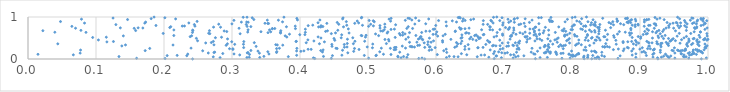
| Category | Series 0 |
|---|---|
| 0.24205689073162623 | 0.001 |
| 0.5834555230468341 | 0.002 |
| 0.9263703860872018 | 0.003 |
| 0.9902408202986827 | 0.004 |
| 0.8291067344623665 | 0.005 |
| 0.8178307525034634 | 0.006 |
| 0.8400675012704694 | 0.007 |
| 0.7462016074231488 | 0.008 |
| 0.6856056325484058 | 0.009 |
| 0.2016072167252148 | 0.01 |
| 0.42173816963347577 | 0.011 |
| 0.5745983142408261 | 0.012 |
| 0.446124398810435 | 0.013 |
| 0.8675882755222408 | 0.014 |
| 0.8357171675206022 | 0.015 |
| 0.785211908813913 | 0.016 |
| 0.15973413688587618 | 0.017 |
| 0.5009533023470878 | 0.018 |
| 0.8335764846936609 | 0.019 |
| 0.9717467180822348 | 0.02 |
| 0.9512849242277234 | 0.021 |
| 0.7972485682354438 | 0.022 |
| 0.5794474353078632 | 0.023 |
| 0.713394292914638 | 0.024 |
| 0.9975322524047576 | 0.025 |
| 0.4197658272013632 | 0.026 |
| 0.8229744605567039 | 0.027 |
| 0.9257722374405295 | 0.028 |
| 0.5486734143937347 | 0.029 |
| 0.9428053404983558 | 0.03 |
| 0.6962093785871877 | 0.031 |
| 0.2825017324264942 | 0.032 |
| 0.7530674486180673 | 0.033 |
| 0.6153970054187725 | 0.034 |
| 0.3219353120712748 | 0.035 |
| 0.34076091171720196 | 0.036 |
| 0.7637678185612877 | 0.037 |
| 0.5571889665695007 | 0.038 |
| 0.8939043022871926 | 0.039 |
| 0.3253150095543737 | 0.04 |
| 0.8389605966028697 | 0.041 |
| 0.6777095777613078 | 0.042 |
| 0.9315042345172243 | 0.043 |
| 0.8170834396213889 | 0.044 |
| 0.9191426719083583 | 0.045 |
| 0.8231961599162155 | 0.046 |
| 0.9416617662311146 | 0.047 |
| 0.9648278417991749 | 0.048 |
| 0.5441939767214274 | 0.049 |
| 0.8374769481175671 | 0.05 |
| 0.27249339708742004 | 0.051 |
| 0.7171692802267854 | 0.052 |
| 0.6325138611821493 | 0.053 |
| 0.660695487391268 | 0.054 |
| 0.9676928087851172 | 0.055 |
| 0.3828518817628516 | 0.056 |
| 0.6265141953982992 | 0.057 |
| 0.133804860888613 | 0.058 |
| 0.5523870485807223 | 0.059 |
| 0.8477426205458636 | 0.06 |
| 0.9639104732571785 | 0.061 |
| 0.4345416529370042 | 0.062 |
| 0.346927104693528 | 0.063 |
| 0.6195624282289387 | 0.064 |
| 0.5438661104671647 | 0.065 |
| 0.8008854926883698 | 0.066 |
| 0.9347986931342904 | 0.067 |
| 0.7208049720291315 | 0.068 |
| 0.8177155724072791 | 0.069 |
| 0.8046382924731201 | 0.07 |
| 0.6882361211552779 | 0.071 |
| 0.9453475826081735 | 0.072 |
| 0.8022181116446973 | 0.073 |
| 0.6890975781424952 | 0.074 |
| 0.8707659925870614 | 0.075 |
| 0.7292288013186655 | 0.076 |
| 0.9395475771430393 | 0.077 |
| 0.2335441791927017 | 0.078 |
| 0.5116418523234801 | 0.079 |
| 0.44771776410358477 | 0.08 |
| 0.20464590029455781 | 0.081 |
| 0.8439408494191557 | 0.082 |
| 0.9093582169060935 | 0.083 |
| 0.8305041743603956 | 0.084 |
| 0.4946027166648584 | 0.085 |
| 0.21936245110016322 | 0.086 |
| 0.7985134555732452 | 0.087 |
| 0.3950776898445026 | 0.088 |
| 0.5123044944880372 | 0.089 |
| 0.8233392075472719 | 0.09 |
| 0.4616097077237403 | 0.091 |
| 0.9729984853158574 | 0.092 |
| 0.6663540896584635 | 0.093 |
| 0.8885416575196844 | 0.094 |
| 0.6715264407055564 | 0.095 |
| 0.8013334454982551 | 0.096 |
| 0.3113658421585407 | 0.097 |
| 0.964575616553435 | 0.098 |
| 0.06666667838972837 | 0.099 |
| 0.7097229706511804 | 0.1 |
| 0.6452586074628226 | 0.101 |
| 0.7144393302943459 | 0.102 |
| 0.8069005495552453 | 0.103 |
| 0.5586465298602132 | 0.104 |
| 0.6019350951166507 | 0.105 |
| 0.9759736476502108 | 0.106 |
| 0.5337749565718211 | 0.107 |
| 0.7774976790599534 | 0.108 |
| 0.3257487222347137 | 0.109 |
| 0.9829123280076261 | 0.11 |
| 0.9188379794238268 | 0.111 |
| 0.014668085009601208 | 0.112 |
| 0.5227122172664884 | 0.113 |
| 0.7954677442896916 | 0.114 |
| 0.745559671468521 | 0.115 |
| 0.9375169310855509 | 0.116 |
| 0.2349852604139013 | 0.117 |
| 0.7957259100381745 | 0.118 |
| 0.35434886356742107 | 0.119 |
| 0.30293943835276244 | 0.12 |
| 0.809973361927424 | 0.121 |
| 0.960519921300205 | 0.122 |
| 0.8939514636304495 | 0.123 |
| 0.7436727593851542 | 0.124 |
| 0.9778392275432664 | 0.125 |
| 0.960863681554112 | 0.126 |
| 0.6373547500469665 | 0.127 |
| 0.6846752663872728 | 0.128 |
| 0.8094812916844065 | 0.129 |
| 0.2864530213845176 | 0.13 |
| 0.8095241710766525 | 0.131 |
| 0.9795934921756614 | 0.132 |
| 0.783775620037591 | 0.133 |
| 0.9205133624781934 | 0.134 |
| 0.7678927684292138 | 0.135 |
| 0.9710639248140867 | 0.136 |
| 0.7015336930465437 | 0.137 |
| 0.78693123598428 | 0.138 |
| 0.34030641638963843 | 0.139 |
| 0.07670811117182919 | 0.14 |
| 0.7767933382393762 | 0.141 |
| 0.9513066725945237 | 0.142 |
| 0.2651459383407172 | 0.143 |
| 0.9920012197920969 | 0.144 |
| 0.32241331174470805 | 0.145 |
| 0.7592727641152089 | 0.146 |
| 0.4703293602537986 | 0.147 |
| 0.9081234858278582 | 0.148 |
| 0.6967008585284777 | 0.149 |
| 0.7613366894837106 | 0.15 |
| 0.7049680455251625 | 0.151 |
| 0.9729335320122706 | 0.152 |
| 0.3235952076423468 | 0.153 |
| 0.27347545295776227 | 0.154 |
| 0.3655177406982778 | 0.155 |
| 0.7764128381559762 | 0.156 |
| 0.6158213532081118 | 0.157 |
| 0.8354322324054811 | 0.158 |
| 0.9299492396545245 | 0.159 |
| 0.8438570506298135 | 0.16 |
| 0.7184587417686823 | 0.161 |
| 0.5466463155740824 | 0.162 |
| 0.7400194913570332 | 0.163 |
| 0.2746247432140186 | 0.164 |
| 0.9027677317595887 | 0.165 |
| 0.7683102171802988 | 0.166 |
| 0.43302911748130085 | 0.167 |
| 0.7760430827437277 | 0.168 |
| 0.6920986451529269 | 0.169 |
| 0.7619003909260341 | 0.17 |
| 0.5172911492180268 | 0.171 |
| 0.9777748916052434 | 0.172 |
| 0.3526970619683715 | 0.173 |
| 0.9905202558672441 | 0.174 |
| 0.9893204668001245 | 0.175 |
| 0.3658900113440076 | 0.176 |
| 0.8340615326602843 | 0.177 |
| 0.6861420343213775 | 0.178 |
| 0.7652841763965242 | 0.179 |
| 0.9056231066859116 | 0.18 |
| 0.9850133569604297 | 0.181 |
| 0.47897600698141374 | 0.182 |
| 0.4013302055376724 | 0.183 |
| 0.8288523711050375 | 0.184 |
| 0.7493189545988588 | 0.185 |
| 0.8328991154930446 | 0.186 |
| 0.9590927789592565 | 0.187 |
| 0.3382040535337245 | 0.188 |
| 0.7993858443803757 | 0.189 |
| 0.8878258723299189 | 0.19 |
| 0.3950278307335754 | 0.191 |
| 0.9592194836023622 | 0.192 |
| 0.4057744827877197 | 0.193 |
| 0.9489546333223964 | 0.194 |
| 0.25688146245141874 | 0.195 |
| 0.6113996448847994 | 0.196 |
| 0.8754615488586553 | 0.197 |
| 0.9873023142587333 | 0.198 |
| 0.1723325806796004 | 0.199 |
| 0.4304839658393635 | 0.2 |
| 0.9564014765936392 | 0.201 |
| 0.9651437258255525 | 0.202 |
| 0.32778871010257893 | 0.203 |
| 0.9620078467304354 | 0.204 |
| 0.8207490215397654 | 0.205 |
| 0.5900059246834644 | 0.206 |
| 0.9470664870901452 | 0.207 |
| 0.4625970322010442 | 0.208 |
| 0.9299640899828344 | 0.209 |
| 0.9670944123393544 | 0.21 |
| 0.9552205234174423 | 0.211 |
| 0.9195433291157692 | 0.212 |
| 0.07732807185703817 | 0.213 |
| 0.9783716390098799 | 0.214 |
| 0.8175880821998233 | 0.215 |
| 0.679745748641263 | 0.216 |
| 0.4339830471939868 | 0.217 |
| 0.9844703387354559 | 0.218 |
| 0.9943197045019005 | 0.219 |
| 0.593608630250575 | 0.22 |
| 0.5384425386120857 | 0.221 |
| 0.920534441926504 | 0.222 |
| 0.8608695864663789 | 0.223 |
| 0.763945343737911 | 0.224 |
| 0.9819815237848935 | 0.225 |
| 0.5408064594873792 | 0.226 |
| 0.48683813008199156 | 0.227 |
| 0.30134639597442897 | 0.228 |
| 0.6424050178918339 | 0.229 |
| 0.41642668339267286 | 0.23 |
| 0.7222063287306725 | 0.231 |
| 0.4119005723261041 | 0.232 |
| 0.6944750720295223 | 0.233 |
| 0.61500249366964 | 0.234 |
| 0.8997816031872654 | 0.235 |
| 0.9211460038378547 | 0.236 |
| 0.7192062302618909 | 0.237 |
| 0.868180979207175 | 0.238 |
| 0.6485150823996157 | 0.239 |
| 0.966900326906095 | 0.24 |
| 0.8766295280476818 | 0.241 |
| 0.8901247257162751 | 0.242 |
| 0.9152392050451452 | 0.243 |
| 0.30126286391437934 | 0.244 |
| 0.2963968111671182 | 0.245 |
| 0.7870928804792657 | 0.246 |
| 0.9112240688921044 | 0.247 |
| 0.36561000870280036 | 0.248 |
| 0.6982174641738597 | 0.249 |
| 0.45461621948856884 | 0.25 |
| 0.4801415419453036 | 0.251 |
| 0.17902237937965004 | 0.252 |
| 0.3953869875452674 | 0.253 |
| 0.5328979671274986 | 0.254 |
| 0.7412031670939694 | 0.255 |
| 0.3696973536081519 | 0.256 |
| 0.45293102555122416 | 0.257 |
| 0.5196225447009848 | 0.258 |
| 0.23978739433991825 | 0.259 |
| 0.5552080093203892 | 0.26 |
| 0.7213506353090398 | 0.261 |
| 0.9968906389155571 | 0.262 |
| 0.7530838526042326 | 0.263 |
| 0.88284355333721 | 0.264 |
| 0.9506374934551941 | 0.265 |
| 0.6616766785138437 | 0.266 |
| 0.5065270863298715 | 0.267 |
| 0.9033646407990166 | 0.268 |
| 0.6616714160286069 | 0.269 |
| 0.995558784772445 | 0.27 |
| 0.5987415291175016 | 0.271 |
| 0.31716639899492094 | 0.272 |
| 0.5389076952612962 | 0.273 |
| 0.7663391172403137 | 0.274 |
| 0.881366850397185 | 0.275 |
| 0.6691696495993199 | 0.276 |
| 0.5834876839399262 | 0.277 |
| 0.6276436789151363 | 0.278 |
| 0.5411951129913218 | 0.279 |
| 0.46529612087659367 | 0.28 |
| 0.8197691588235482 | 0.281 |
| 0.8480898187865087 | 0.282 |
| 0.8550215000162087 | 0.283 |
| 0.5683076797020896 | 0.284 |
| 0.590446386761 | 0.285 |
| 0.46919693754465713 | 0.286 |
| 0.4988330456822548 | 0.287 |
| 0.564797112947197 | 0.288 |
| 0.5912809115843534 | 0.289 |
| 0.9309722991393891 | 0.29 |
| 0.9965059732982974 | 0.291 |
| 0.7592543525011789 | 0.292 |
| 0.8451815299102808 | 0.293 |
| 0.8481280103002533 | 0.294 |
| 0.5643457690631709 | 0.295 |
| 0.7804409375162544 | 0.296 |
| 0.8518240790495873 | 0.297 |
| 0.5620666765813516 | 0.298 |
| 0.642677593337187 | 0.299 |
| 0.33548239331852764 | 0.3 |
| 0.44709187649267174 | 0.301 |
| 0.7040097888339266 | 0.302 |
| 0.7649021776310706 | 0.303 |
| 0.6304542417375598 | 0.304 |
| 0.9700208710317959 | 0.305 |
| 0.9128502137312071 | 0.306 |
| 0.5504315336959569 | 0.307 |
| 0.9138021153852188 | 0.308 |
| 0.7851295898285204 | 0.309 |
| 0.7066130355292927 | 0.31 |
| 0.13799997025142466 | 0.311 |
| 0.760650675874105 | 0.312 |
| 0.6881483260649826 | 0.313 |
| 0.6831582032449409 | 0.314 |
| 0.9986831331072369 | 0.315 |
| 0.6942299951698313 | 0.316 |
| 0.7877668729373265 | 0.317 |
| 0.9869454595743438 | 0.318 |
| 0.7140296501242762 | 0.319 |
| 0.7192746235623204 | 0.32 |
| 0.9419271972147735 | 0.321 |
| 0.8259699637071092 | 0.322 |
| 0.5731661083238024 | 0.323 |
| 0.6846468217525756 | 0.324 |
| 0.7602505450645869 | 0.325 |
| 0.2914057769520731 | 0.326 |
| 0.805241943759 | 0.327 |
| 0.7903331436457373 | 0.328 |
| 0.575708927504781 | 0.329 |
| 0.3746618447776595 | 0.33 |
| 0.7129880850665812 | 0.331 |
| 0.9303542125567408 | 0.332 |
| 0.2132756593833871 | 0.333 |
| 0.36666400091261053 | 0.334 |
| 0.14339060912757623 | 0.335 |
| 0.8943656528321123 | 0.336 |
| 0.2734858584954104 | 0.337 |
| 0.7831115230008824 | 0.338 |
| 0.8137146026950943 | 0.339 |
| 0.9686538891428932 | 0.34 |
| 0.36436942032683484 | 0.341 |
| 0.6472915225828849 | 0.342 |
| 0.5879162964308708 | 0.343 |
| 0.9757262813959675 | 0.344 |
| 0.4651107264871025 | 0.345 |
| 0.7653920418975568 | 0.346 |
| 0.6732649410759365 | 0.347 |
| 0.4468323264745075 | 0.348 |
| 0.30398252353562716 | 0.349 |
| 0.31685867958278957 | 0.35 |
| 0.8069848253620312 | 0.351 |
| 0.8650417865222074 | 0.352 |
| 0.9848607581657151 | 0.353 |
| 0.7717038778368868 | 0.354 |
| 0.5069947398855135 | 0.355 |
| 0.9955347377064226 | 0.356 |
| 0.9263562809152868 | 0.357 |
| 0.9402328243567426 | 0.358 |
| 0.890318533067163 | 0.359 |
| 0.6320342243449587 | 0.36 |
| 0.043846194675616894 | 0.361 |
| 0.29322089172594956 | 0.362 |
| 0.4285804620854295 | 0.363 |
| 0.4784786212749767 | 0.364 |
| 0.9414950856405374 | 0.365 |
| 0.8496623262643965 | 0.366 |
| 0.5270410140656123 | 0.367 |
| 0.6364960141798016 | 0.368 |
| 0.4695157925199909 | 0.369 |
| 0.925035511394645 | 0.37 |
| 0.9775785949908147 | 0.371 |
| 0.9692841117984702 | 0.372 |
| 0.930859674967808 | 0.373 |
| 0.8096840525599986 | 0.374 |
| 0.7222768591568567 | 0.375 |
| 0.9588608628370394 | 0.376 |
| 0.9323756248813405 | 0.377 |
| 0.8978768764498211 | 0.378 |
| 0.8322970202519611 | 0.379 |
| 0.6973839429163243 | 0.38 |
| 0.7964553188551072 | 0.381 |
| 0.2613185801255118 | 0.382 |
| 0.9133302018802346 | 0.383 |
| 0.5826581410349492 | 0.384 |
| 0.917712273366248 | 0.385 |
| 0.7167025580771422 | 0.386 |
| 0.40914004007676913 | 0.387 |
| 0.7059911276745123 | 0.388 |
| 0.3327936445539578 | 0.389 |
| 0.8752363302064999 | 0.39 |
| 0.6300814970282244 | 0.391 |
| 0.26963540204020947 | 0.392 |
| 0.721219710569494 | 0.393 |
| 0.9849627325589546 | 0.394 |
| 0.9123455372027787 | 0.395 |
| 0.9385431247654756 | 0.396 |
| 0.5610720334003393 | 0.397 |
| 0.778297074762367 | 0.398 |
| 0.5927738825399984 | 0.399 |
| 0.5719061832937146 | 0.4 |
| 0.6780761025758281 | 0.401 |
| 0.6790008889340784 | 0.402 |
| 0.6097666287318152 | 0.403 |
| 0.894740814041136 | 0.404 |
| 0.7333688406022533 | 0.405 |
| 0.9870197727454522 | 0.406 |
| 0.11602610526543165 | 0.407 |
| 0.4359407657658096 | 0.408 |
| 0.5882758604850573 | 0.409 |
| 0.8820754786122534 | 0.41 |
| 0.2995697110233363 | 0.411 |
| 0.9247580332528726 | 0.412 |
| 0.9717912966861347 | 0.413 |
| 0.8751380296867617 | 0.414 |
| 0.3173854035456282 | 0.415 |
| 0.12562279636841212 | 0.416 |
| 0.39420401596767496 | 0.417 |
| 0.8877267944712834 | 0.418 |
| 0.2725759114047593 | 0.419 |
| 0.39462730521874945 | 0.42 |
| 0.9100318589141115 | 0.421 |
| 0.4807688805247739 | 0.422 |
| 0.49512967216409437 | 0.423 |
| 0.9440941763909309 | 0.424 |
| 0.6380825300709418 | 0.425 |
| 0.768131203720871 | 0.426 |
| 0.7230860663045998 | 0.427 |
| 0.5308102033148787 | 0.428 |
| 0.4204503056325218 | 0.429 |
| 0.7455397172409073 | 0.43 |
| 0.596363969713643 | 0.431 |
| 0.983393743084812 | 0.432 |
| 0.9452246929251462 | 0.433 |
| 0.24939293380626326 | 0.434 |
| 0.7921846817646974 | 0.435 |
| 0.9521035210047721 | 0.436 |
| 0.6095776049920606 | 0.437 |
| 0.8238547732449709 | 0.438 |
| 0.6757798489177259 | 0.439 |
| 0.9721646645606914 | 0.44 |
| 0.8934033535964474 | 0.441 |
| 0.6591868569127246 | 0.442 |
| 0.7556520988726274 | 0.443 |
| 0.8645112217845645 | 0.444 |
| 0.45118060628140977 | 0.445 |
| 0.8356993479412494 | 0.446 |
| 0.9984284901197041 | 0.447 |
| 0.6937772107421449 | 0.448 |
| 0.8412697358720088 | 0.449 |
| 0.8193308479295132 | 0.45 |
| 0.834140470461542 | 0.451 |
| 0.8100662499951372 | 0.452 |
| 0.10353440462740826 | 0.453 |
| 0.7747741985348588 | 0.454 |
| 0.4115904213588252 | 0.455 |
| 0.7942768991483344 | 0.456 |
| 0.8515200727936791 | 0.457 |
| 0.5804429259917449 | 0.458 |
| 0.984032632363786 | 0.459 |
| 0.9611167584126035 | 0.46 |
| 0.9934705812542584 | 0.461 |
| 0.947167752277172 | 0.462 |
| 0.9949147445856045 | 0.463 |
| 0.5302553836130848 | 0.464 |
| 0.5249219272648055 | 0.465 |
| 0.734394215730649 | 0.466 |
| 0.6540691921464084 | 0.467 |
| 0.6219075520482081 | 0.468 |
| 0.9999265238370852 | 0.469 |
| 0.5556569179160228 | 0.47 |
| 0.4697484311439244 | 0.471 |
| 0.7774029407939884 | 0.472 |
| 0.7089452224348054 | 0.473 |
| 0.5796112170920036 | 0.474 |
| 0.5741408118515702 | 0.475 |
| 0.7525664479319855 | 0.476 |
| 0.9717718059798897 | 0.477 |
| 0.29346037915965156 | 0.478 |
| 0.7486180312418456 | 0.479 |
| 0.6495307116565011 | 0.48 |
| 0.764448816958143 | 0.481 |
| 0.9782383462707043 | 0.482 |
| 0.6630535249990825 | 0.483 |
| 0.9488130716213661 | 0.484 |
| 0.7961113290379602 | 0.485 |
| 0.9345936356908431 | 0.486 |
| 0.4500194495454245 | 0.487 |
| 0.9418782183626292 | 0.488 |
| 0.9955815814746685 | 0.489 |
| 0.9795357223826484 | 0.49 |
| 0.7380515693944312 | 0.491 |
| 0.2476223311318801 | 0.492 |
| 0.9009395557838586 | 0.493 |
| 0.57620398960069 | 0.494 |
| 0.828609163427909 | 0.495 |
| 0.6367263565297367 | 0.496 |
| 0.5903678407442536 | 0.497 |
| 0.9183296454386317 | 0.498 |
| 0.8395419233162704 | 0.499 |
| 0.4308230700510241 | 0.5 |
| 0.7796951465721568 | 0.501 |
| 0.665263193676942 | 0.502 |
| 0.9646972743974991 | 0.503 |
| 0.4605965948071052 | 0.504 |
| 0.4776435986348785 | 0.505 |
| 0.6632453647807789 | 0.506 |
| 0.27559937561148773 | 0.507 |
| 0.9273512969387311 | 0.508 |
| 0.8206788248068952 | 0.509 |
| 0.638228305808191 | 0.51 |
| 0.8296671024779321 | 0.511 |
| 0.09509539738751797 | 0.512 |
| 0.888520489937803 | 0.513 |
| 0.5399926533766995 | 0.514 |
| 0.988125717334292 | 0.515 |
| 0.8620917906376229 | 0.516 |
| 0.5592802240389166 | 0.517 |
| 0.28460908869118634 | 0.518 |
| 0.11517072170387284 | 0.519 |
| 0.6514651893751855 | 0.52 |
| 0.4962408917236061 | 0.521 |
| 0.7316766866428468 | 0.522 |
| 0.3806776340163819 | 0.523 |
| 0.576998981580232 | 0.524 |
| 0.6853915498852176 | 0.525 |
| 0.42663972051983606 | 0.526 |
| 0.8368700062228468 | 0.527 |
| 0.9012563812129785 | 0.528 |
| 0.8483923008013307 | 0.529 |
| 0.7309279453902061 | 0.53 |
| 0.8468012947065404 | 0.531 |
| 0.23847867282725657 | 0.532 |
| 0.577878149434858 | 0.533 |
| 0.8973518386931449 | 0.534 |
| 0.733948295403089 | 0.535 |
| 0.6613119189429705 | 0.536 |
| 0.7479986404525191 | 0.537 |
| 0.9683249316555466 | 0.538 |
| 0.9322447644638544 | 0.539 |
| 0.8073179348032824 | 0.54 |
| 0.7891868497689679 | 0.541 |
| 0.709426897848511 | 0.542 |
| 0.710902321197257 | 0.543 |
| 0.9546272437431139 | 0.544 |
| 0.6025042190709158 | 0.545 |
| 0.689135309171002 | 0.546 |
| 0.9987647745514932 | 0.547 |
| 0.8042563931031884 | 0.548 |
| 0.926530549102094 | 0.549 |
| 0.14020806192634802 | 0.55 |
| 0.37821140909405393 | 0.551 |
| 0.6104130736947574 | 0.552 |
| 0.24065601539673973 | 0.553 |
| 0.4910095731964429 | 0.554 |
| 0.8612326003306462 | 0.555 |
| 0.5156577015779038 | 0.556 |
| 0.6568719833213035 | 0.557 |
| 0.8227811210227967 | 0.558 |
| 0.21447704734697703 | 0.559 |
| 0.5704210576484507 | 0.56 |
| 0.4900213707516423 | 0.561 |
| 0.936958101224879 | 0.562 |
| 0.7890999321325118 | 0.563 |
| 0.9868744097618726 | 0.564 |
| 0.49714253716267365 | 0.565 |
| 0.6980302528923369 | 0.566 |
| 0.5510753083407023 | 0.567 |
| 0.8852127402288062 | 0.568 |
| 0.7111267659395498 | 0.569 |
| 0.5476062456798978 | 0.57 |
| 0.7440759456877509 | 0.571 |
| 0.7659206048920337 | 0.572 |
| 0.7897927427319142 | 0.573 |
| 0.6589118058321162 | 0.574 |
| 0.6380710001486061 | 0.575 |
| 0.4613000530146274 | 0.576 |
| 0.7929473378199278 | 0.577 |
| 0.6695072797972426 | 0.578 |
| 0.3996874439885593 | 0.579 |
| 0.4072106275384636 | 0.58 |
| 0.8036927457515313 | 0.581 |
| 0.8226901005948686 | 0.582 |
| 0.9047197442529763 | 0.583 |
| 0.7520754816201959 | 0.584 |
| 0.6704948703670238 | 0.585 |
| 0.5957096177536303 | 0.586 |
| 0.8523546201107909 | 0.587 |
| 0.613580408228039 | 0.588 |
| 0.7176708607150065 | 0.589 |
| 0.7463399180349358 | 0.59 |
| 0.38454576762262765 | 0.591 |
| 0.5997928197410857 | 0.592 |
| 0.8668841240815273 | 0.593 |
| 0.6978046369181365 | 0.594 |
| 0.909144904250916 | 0.595 |
| 0.5111134345581675 | 0.596 |
| 0.7524392001795942 | 0.597 |
| 0.5544464368283548 | 0.598 |
| 0.8393651948067554 | 0.599 |
| 0.7277725144449844 | 0.6 |
| 0.31198337876594284 | 0.601 |
| 0.9297743536626786 | 0.602 |
| 0.2673669266537842 | 0.603 |
| 0.4461094973802431 | 0.604 |
| 0.9983611601948713 | 0.605 |
| 0.546162635983288 | 0.606 |
| 0.9108605861800836 | 0.607 |
| 0.9746520299254213 | 0.608 |
| 0.19881816290991422 | 0.609 |
| 0.9578048837684787 | 0.61 |
| 0.6484090662804648 | 0.611 |
| 0.7967150058995691 | 0.612 |
| 0.26567687817336905 | 0.613 |
| 0.7378591329232346 | 0.614 |
| 0.8874462273105074 | 0.615 |
| 0.643574590151754 | 0.616 |
| 0.37144531654099555 | 0.617 |
| 0.5281529204002721 | 0.618 |
| 0.4721917706159294 | 0.619 |
| 0.8845545384793312 | 0.62 |
| 0.4522387328087377 | 0.621 |
| 0.7576965459107182 | 0.622 |
| 0.923474186264426 | 0.623 |
| 0.7135802128095012 | 0.624 |
| 0.7235339745147519 | 0.625 |
| 0.6450406978768206 | 0.626 |
| 0.35295108601198827 | 0.627 |
| 0.5610238734500754 | 0.628 |
| 0.5510386367941369 | 0.629 |
| 0.6899735703410564 | 0.63 |
| 0.5789209946915523 | 0.631 |
| 0.2418070893402413 | 0.632 |
| 0.7754578754289262 | 0.633 |
| 0.0852769160216056 | 0.634 |
| 0.4078727488975993 | 0.635 |
| 0.3712790288937329 | 0.636 |
| 0.039490333040056586 | 0.637 |
| 0.8783164538996194 | 0.638 |
| 0.8339077426016506 | 0.639 |
| 0.7311077793405872 | 0.64 |
| 0.32314109908870825 | 0.641 |
| 0.7445657039074626 | 0.642 |
| 0.9890183988278514 | 0.643 |
| 0.9887046773446877 | 0.644 |
| 0.5292566349847074 | 0.645 |
| 0.6011800566449759 | 0.646 |
| 0.3569140674526863 | 0.647 |
| 0.9796888383406281 | 0.648 |
| 0.9184491387022996 | 0.649 |
| 0.34257965851868 | 0.65 |
| 0.8286580668331347 | 0.651 |
| 0.8696664681134617 | 0.652 |
| 0.2923396727504834 | 0.653 |
| 0.6282645675564993 | 0.654 |
| 0.9333300798715094 | 0.655 |
| 0.9070581281481694 | 0.656 |
| 0.4376741420428443 | 0.657 |
| 0.9250613633005713 | 0.658 |
| 0.7908163136585158 | 0.659 |
| 0.8396855013388071 | 0.66 |
| 0.8197520968138204 | 0.661 |
| 0.5851330770967711 | 0.662 |
| 0.5907390865755683 | 0.663 |
| 0.5217298821827239 | 0.664 |
| 0.6284947653874785 | 0.665 |
| 0.7448566019761392 | 0.666 |
| 0.28848564950697475 | 0.667 |
| 0.5187825987746371 | 0.668 |
| 0.7873648607581865 | 0.669 |
| 0.9522051251919688 | 0.67 |
| 0.44039696810709505 | 0.671 |
| 0.7588286913672996 | 0.672 |
| 0.3717911715657269 | 0.673 |
| 0.021876951333617462 | 0.674 |
| 0.26686893632975844 | 0.675 |
| 0.24243446323115833 | 0.676 |
| 0.15831174510369156 | 0.677 |
| 0.8332527349385097 | 0.678 |
| 0.7855025360475109 | 0.679 |
| 0.96816092405442 | 0.68 |
| 0.9278824926817861 | 0.681 |
| 0.07784660784897014 | 0.682 |
| 0.9125829651673883 | 0.683 |
| 0.45559305185873444 | 0.684 |
| 0.8491528855034775 | 0.685 |
| 0.7656431019893768 | 0.686 |
| 0.7145060311489916 | 0.687 |
| 0.24217609825460099 | 0.688 |
| 0.7516470912277733 | 0.689 |
| 0.8257766364235992 | 0.69 |
| 0.21452594090229155 | 0.691 |
| 0.6832349163694147 | 0.692 |
| 0.3551585981923355 | 0.693 |
| 0.886614330348981 | 0.694 |
| 0.32365621446081705 | 0.695 |
| 0.6670916863874407 | 0.696 |
| 0.5238460696344532 | 0.697 |
| 0.6793366741537319 | 0.698 |
| 0.7986312064136906 | 0.699 |
| 0.8006366922144128 | 0.7 |
| 0.9350700044859515 | 0.701 |
| 0.6939491541200654 | 0.702 |
| 0.8153117027232798 | 0.703 |
| 0.533879402843065 | 0.704 |
| 0.9954797441601261 | 0.705 |
| 0.7063521184217231 | 0.706 |
| 0.5958591337608953 | 0.707 |
| 0.8399585926525318 | 0.708 |
| 0.6361158945153118 | 0.709 |
| 0.40786817423444416 | 0.71 |
| 0.5388393079859527 | 0.711 |
| 0.5980600001285815 | 0.712 |
| 0.742902629601004 | 0.713 |
| 0.9101874237290115 | 0.714 |
| 0.7380410023206723 | 0.715 |
| 0.4710805383439474 | 0.716 |
| 0.8129385123811759 | 0.717 |
| 0.7074437837231894 | 0.718 |
| 0.7883418672474871 | 0.719 |
| 0.6372714376163425 | 0.72 |
| 0.3594122737728087 | 0.721 |
| 0.6426580803857185 | 0.722 |
| 0.3933299779036482 | 0.723 |
| 0.3592915862684097 | 0.724 |
| 0.9809643685243148 | 0.725 |
| 0.36295727845518705 | 0.726 |
| 0.5655837704353308 | 0.727 |
| 0.5571142630173374 | 0.728 |
| 0.8864954668961825 | 0.729 |
| 0.15616699097610157 | 0.73 |
| 0.9210258440607605 | 0.731 |
| 0.31039018632332344 | 0.732 |
| 0.06993485075270356 | 0.733 |
| 0.9494630743864263 | 0.734 |
| 0.6486932468547623 | 0.735 |
| 0.5176520173206445 | 0.736 |
| 0.9383819595692526 | 0.737 |
| 0.16890892099176302 | 0.738 |
| 0.714335209242536 | 0.739 |
| 0.9987123197607971 | 0.74 |
| 0.1357844415851879 | 0.741 |
| 0.1619831475735283 | 0.742 |
| 0.9833452480816416 | 0.743 |
| 0.9575934869618838 | 0.744 |
| 0.9800930563497895 | 0.745 |
| 0.8568612754369276 | 0.746 |
| 0.634523380533706 | 0.747 |
| 0.7022982502751465 | 0.748 |
| 0.20846149381874404 | 0.749 |
| 0.7456313793337191 | 0.75 |
| 0.7081995664233844 | 0.751 |
| 0.8377748644866299 | 0.752 |
| 0.9424647118296513 | 0.753 |
| 0.7608118678461379 | 0.754 |
| 0.8400729367200854 | 0.755 |
| 0.5248887751735515 | 0.756 |
| 0.2831948971209865 | 0.757 |
| 0.9684234983380716 | 0.758 |
| 0.2728704566943579 | 0.759 |
| 0.746690817655281 | 0.76 |
| 0.43056427579811696 | 0.761 |
| 0.6799058918280549 | 0.762 |
| 0.42737032801329927 | 0.763 |
| 0.7805313622216911 | 0.764 |
| 0.46397182760781175 | 0.765 |
| 0.9835115411559512 | 0.766 |
| 0.3800681738306879 | 0.767 |
| 0.6789305681856657 | 0.768 |
| 0.20993225468592844 | 0.769 |
| 0.5592251635219795 | 0.77 |
| 0.32774672081760636 | 0.771 |
| 0.8929092376165111 | 0.772 |
| 0.43362587955341286 | 0.773 |
| 0.8002464236477083 | 0.774 |
| 0.7311340431712472 | 0.775 |
| 0.32218022318639683 | 0.776 |
| 0.06452796883870987 | 0.777 |
| 0.8202638457396785 | 0.778 |
| 0.5009429435592504 | 0.779 |
| 0.9062280196266048 | 0.78 |
| 0.8170452030965549 | 0.781 |
| 0.24555399257959704 | 0.782 |
| 0.3930118608389428 | 0.783 |
| 0.22683832963020803 | 0.784 |
| 0.9597345865379482 | 0.785 |
| 0.2300903540230134 | 0.786 |
| 0.6153228773407612 | 0.787 |
| 0.5079769039294053 | 0.788 |
| 0.8343490505245593 | 0.789 |
| 0.8198286427002948 | 0.79 |
| 0.9423129865790653 | 0.791 |
| 0.9657738302996378 | 0.792 |
| 0.430926623100336 | 0.793 |
| 0.4120688740501193 | 0.794 |
| 0.5175809865374742 | 0.795 |
| 0.9556329671267478 | 0.796 |
| 0.9897836869849478 | 0.797 |
| 0.18817760368983497 | 0.798 |
| 0.5996167265139611 | 0.799 |
| 0.9126107109073274 | 0.8 |
| 0.9234584313853333 | 0.801 |
| 0.4918868477733745 | 0.802 |
| 0.9148491510365467 | 0.803 |
| 0.4687646990796413 | 0.804 |
| 0.8885481724250899 | 0.805 |
| 0.4187648692933069 | 0.806 |
| 0.8973092380497092 | 0.807 |
| 0.8024533866085688 | 0.808 |
| 0.6980397779691443 | 0.809 |
| 0.8273987654550987 | 0.81 |
| 0.8036111481909587 | 0.811 |
| 0.9932518906955408 | 0.812 |
| 0.861011636418858 | 0.813 |
| 0.8929167644104867 | 0.814 |
| 0.5406471377757759 | 0.815 |
| 0.8316964126217326 | 0.816 |
| 0.876057154151456 | 0.817 |
| 0.7219109076856601 | 0.818 |
| 0.12926141129381868 | 0.819 |
| 0.24464534051266412 | 0.82 |
| 0.8410002542289892 | 0.821 |
| 0.32096411139473985 | 0.822 |
| 0.8337604406312144 | 0.823 |
| 0.676004486146394 | 0.824 |
| 0.6693640613746317 | 0.825 |
| 0.4570319633268484 | 0.826 |
| 0.5039545035711275 | 0.827 |
| 0.8970927233477463 | 0.828 |
| 0.2804883229274054 | 0.829 |
| 0.5247459154128544 | 0.83 |
| 0.7246022727377411 | 0.831 |
| 0.5688988287390967 | 0.832 |
| 0.9229762777086179 | 0.833 |
| 0.9440292522783431 | 0.834 |
| 0.969361012586506 | 0.835 |
| 0.29989815727035013 | 0.836 |
| 0.9829879478161334 | 0.837 |
| 0.5848637342964348 | 0.838 |
| 0.8134178793259009 | 0.839 |
| 0.9209122311854826 | 0.84 |
| 0.8714069174117653 | 0.841 |
| 0.7513550458645649 | 0.842 |
| 0.857318585025265 | 0.843 |
| 0.9960538605264491 | 0.844 |
| 0.35381892910559254 | 0.845 |
| 0.9771029989785495 | 0.846 |
| 0.3525651986110863 | 0.847 |
| 0.43946764408031264 | 0.848 |
| 0.48051125447275217 | 0.849 |
| 0.34849307326132806 | 0.85 |
| 0.7296097345163234 | 0.851 |
| 0.995075413003142 | 0.852 |
| 0.9485922601988852 | 0.853 |
| 0.1717022748991612 | 0.854 |
| 0.08313243208031329 | 0.855 |
| 0.9545811109907378 | 0.856 |
| 0.6840337228095684 | 0.857 |
| 0.23654739437502706 | 0.858 |
| 0.48625684729141755 | 0.859 |
| 0.9596900030269689 | 0.86 |
| 0.6985299112451283 | 0.861 |
| 0.8827129374473647 | 0.862 |
| 0.42650149639800816 | 0.863 |
| 0.8285719824023501 | 0.864 |
| 0.9794518591745881 | 0.865 |
| 0.8862932407228606 | 0.866 |
| 0.8543736670711055 | 0.867 |
| 0.9532566837189448 | 0.868 |
| 0.9398555511920632 | 0.869 |
| 0.45477613512885456 | 0.87 |
| 0.7374162711934478 | 0.871 |
| 0.7069722271944635 | 0.872 |
| 0.9668255859951156 | 0.873 |
| 0.7152493848681072 | 0.874 |
| 0.8809544463237887 | 0.875 |
| 0.3237652881400549 | 0.876 |
| 0.8342404275760432 | 0.877 |
| 0.3137869853440407 | 0.878 |
| 0.1730326490405556 | 0.879 |
| 0.3216009438317402 | 0.88 |
| 0.6301742604236608 | 0.881 |
| 0.9064689704963795 | 0.882 |
| 0.614847000067996 | 0.883 |
| 0.3743183090463127 | 0.884 |
| 0.7898701315643016 | 0.885 |
| 0.5092532425482235 | 0.886 |
| 0.8110962346420505 | 0.887 |
| 0.8234730988670845 | 0.888 |
| 0.8600509428828741 | 0.889 |
| 0.46814255851816156 | 0.89 |
| 0.04780196783845404 | 0.891 |
| 0.8665132957150856 | 0.892 |
| 0.7712752938076769 | 0.893 |
| 0.7675200672432394 | 0.894 |
| 0.24868774757715378 | 0.895 |
| 0.769772848226409 | 0.896 |
| 0.8831901217678678 | 0.897 |
| 0.9838634173901563 | 0.898 |
| 0.6818280714779463 | 0.899 |
| 0.9928331260497192 | 0.9 |
| 0.5332429230111094 | 0.901 |
| 0.6390847802971622 | 0.902 |
| 0.7099043568714487 | 0.903 |
| 0.48415373549286833 | 0.904 |
| 0.8938380251673548 | 0.905 |
| 0.8071115903932797 | 0.906 |
| 0.7695885171883088 | 0.907 |
| 0.6240052400892525 | 0.908 |
| 0.8669432023631161 | 0.909 |
| 0.5077007532753354 | 0.91 |
| 0.9981966475224252 | 0.911 |
| 0.5749541153989768 | 0.912 |
| 0.6696336788299472 | 0.913 |
| 0.6937747371485637 | 0.914 |
| 0.6037955577594358 | 0.915 |
| 0.9654825750684013 | 0.916 |
| 0.5017644084909618 | 0.917 |
| 0.6427993959535167 | 0.918 |
| 0.6806587743374949 | 0.919 |
| 0.30285426048273945 | 0.92 |
| 0.554854482992043 | 0.921 |
| 0.8860992148373463 | 0.922 |
| 0.9740636438448073 | 0.923 |
| 0.3682521776909456 | 0.924 |
| 0.3519450260379327 | 0.925 |
| 0.741265037438025 | 0.926 |
| 0.9847067141508127 | 0.927 |
| 0.42927972553997173 | 0.928 |
| 0.5644768066114662 | 0.929 |
| 0.39629402441345246 | 0.93 |
| 0.9094890547029831 | 0.931 |
| 0.7666557853876932 | 0.932 |
| 0.906471004446197 | 0.933 |
| 0.8309750385229613 | 0.934 |
| 0.65123074011356 | 0.935 |
| 0.8876513846922476 | 0.936 |
| 0.9355085822352479 | 0.937 |
| 0.9101022791454887 | 0.938 |
| 0.14644043383945554 | 0.939 |
| 0.3321262224483731 | 0.94 |
| 0.992326889058374 | 0.941 |
| 0.9900446099332977 | 0.942 |
| 0.9129713035911873 | 0.943 |
| 0.7932816463122023 | 0.944 |
| 0.7148552240803235 | 0.945 |
| 0.8931653119694998 | 0.946 |
| 0.7058383019755124 | 0.947 |
| 0.07864962996465316 | 0.948 |
| 0.9250609529651914 | 0.949 |
| 0.5310057859999643 | 0.95 |
| 0.6553572856833898 | 0.951 |
| 0.8659015255732543 | 0.952 |
| 0.5892594776006481 | 0.953 |
| 0.21709459208149356 | 0.954 |
| 0.46268960868191167 | 0.955 |
| 0.6399797684886105 | 0.956 |
| 0.731132821347795 | 0.957 |
| 0.9582891105835639 | 0.958 |
| 0.7152847360827547 | 0.959 |
| 0.8142350982799448 | 0.96 |
| 0.18113520309944173 | 0.961 |
| 0.8810266182900253 | 0.962 |
| 0.9896357054128422 | 0.963 |
| 0.5612874298827959 | 0.964 |
| 0.8786341453024401 | 0.965 |
| 0.9932219486123985 | 0.966 |
| 0.3953580173229781 | 0.967 |
| 0.5340113632132326 | 0.968 |
| 0.8451419333233569 | 0.969 |
| 0.9778578502382392 | 0.97 |
| 0.5588769285042492 | 0.971 |
| 0.9292808733897919 | 0.972 |
| 0.7197671048950679 | 0.973 |
| 0.8815139934699427 | 0.974 |
| 0.12508110739278727 | 0.975 |
| 0.5700316620277985 | 0.976 |
| 0.9762102596256987 | 0.977 |
| 0.6356950454118515 | 0.978 |
| 0.4633330254096641 | 0.979 |
| 0.490276876947368 | 0.98 |
| 0.3297039132827783 | 0.981 |
| 0.20132163654740456 | 0.982 |
| 0.6970706535520693 | 0.983 |
| 0.750978053560906 | 0.984 |
| 0.7549060289439044 | 0.985 |
| 0.8003798431687177 | 0.986 |
| 0.6327369515357248 | 0.987 |
| 0.9220493976805313 | 0.988 |
| 0.7690255830566128 | 0.989 |
| 0.634587318868416 | 0.99 |
| 0.49072020191425975 | 0.991 |
| 0.6846061107554285 | 0.992 |
| 0.31646574748070966 | 0.993 |
| 0.9553024863657649 | 0.994 |
| 0.32209742427229565 | 0.995 |
| 0.37639315677962576 | 0.996 |
| 0.8045361151146847 | 0.997 |
| 0.1853989131649488 | 0.998 |
| 0.8212839738377874 | 0.999 |
| 0.6894307920664725 | 1 |